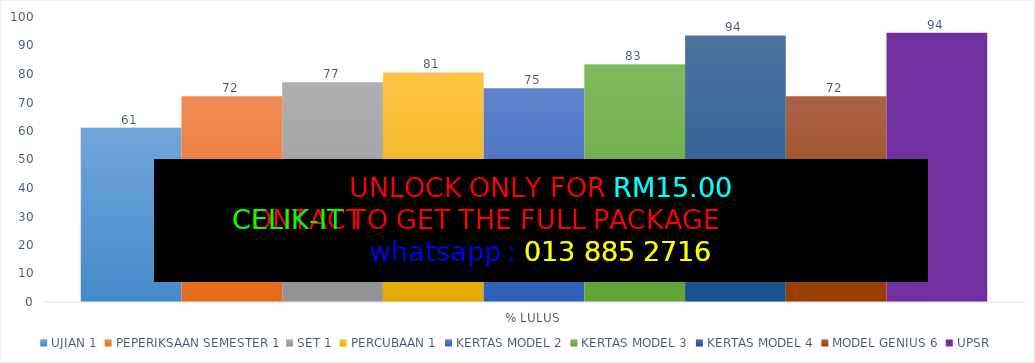
| Category | UJIAN 1 | PEPERIKSAAN SEMESTER 1 | SET 1 | PERCUBAAN 1 | KERTAS MODEL 2 | KERTAS MODEL 3 | KERTAS MODEL 4 | MODEL GENIUS 6 | UPSR |
|---|---|---|---|---|---|---|---|---|---|
| % LULUS | 61.111 | 72.222 | 77.143 | 80.556 | 75 | 83.333 | 93.548 | 72.222 | 94.444 |